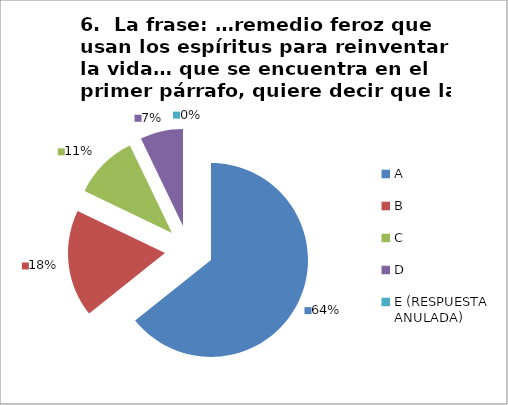
| Category | CANTIDAD DE RESPUESTAS PREGUNTA (6) | PORCENTAJE |
|---|---|---|
| A | 18 | 0.643 |
| B | 5 | 0.179 |
| C | 3 | 0.107 |
| D | 2 | 0.071 |
| E (RESPUESTA ANULADA) | 0 | 0 |